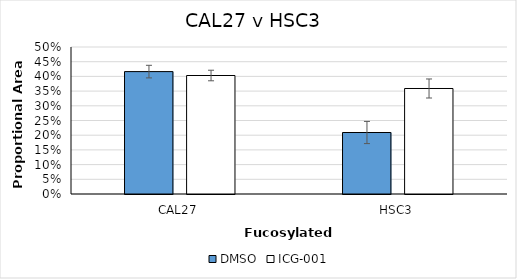
| Category | DMSO | ICG-001 |
|---|---|---|
| 0 | 0.416 | 0.403 |
| 1 | 0.209 | 0.359 |